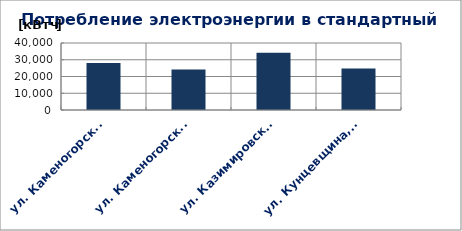
| Category | Series 0 |
|---|---|
| ул. Каменогорская, 30 | 28052 |
| ул. Каменогорская, 86 | 24188 |
| ул. Казимировская, 9 | 34197 |
| ул. Кунцевщина, 35 | 24757 |